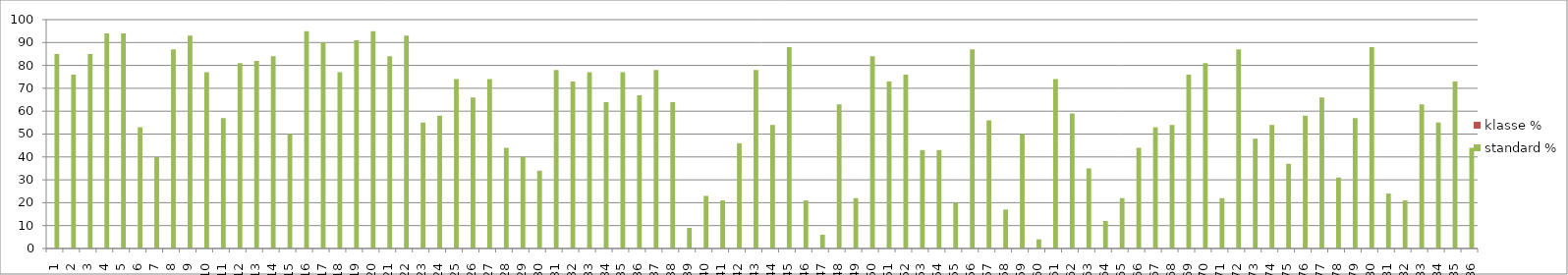
| Category | klasse % | standard % |
|---|---|---|
| 1.0 | 0 | 85 |
| 2.0 | 0 | 76 |
| 3.0 | 0 | 85 |
| 4.0 | 0 | 94 |
| 5.0 | 0 | 94 |
| 6.0 | 0 | 53 |
| 7.0 | 0 | 40 |
| 8.0 | 0 | 87 |
| 9.0 | 0 | 93 |
| 10.0 | 0 | 77 |
| 11.0 | 0 | 57 |
| 12.0 | 0 | 81 |
| 13.0 | 0 | 82 |
| 14.0 | 0 | 84 |
| 15.0 | 0 | 50 |
| 16.0 | 0 | 95 |
| 17.0 | 0 | 90 |
| 18.0 | 0 | 77 |
| 19.0 | 0 | 91 |
| 20.0 | 0 | 95 |
| 21.0 | 0 | 84 |
| 22.0 | 0 | 93 |
| 23.0 | 0 | 55 |
| 24.0 | 0 | 58 |
| 25.0 | 0 | 74 |
| 26.0 | 0 | 66 |
| 27.0 | 0 | 74 |
| 28.0 | 0 | 44 |
| 29.0 | 0 | 40 |
| 30.0 | 0 | 34 |
| 31.0 | 0 | 78 |
| 32.0 | 0 | 73 |
| 33.0 | 0 | 77 |
| 34.0 | 0 | 64 |
| 35.0 | 0 | 77 |
| 36.0 | 0 | 67 |
| 37.0 | 0 | 78 |
| 38.0 | 0 | 64 |
| 39.0 | 0 | 9 |
| 40.0 | 0 | 23 |
| 41.0 | 0 | 21 |
| 42.0 | 0 | 46 |
| 43.0 | 0 | 78 |
| 44.0 | 0 | 54 |
| 45.0 | 0 | 88 |
| 46.0 | 0 | 21 |
| 47.0 | 0 | 6 |
| 48.0 | 0 | 63 |
| 49.0 | 0 | 22 |
| 50.0 | 0 | 84 |
| 51.0 | 0 | 73 |
| 52.0 | 0 | 76 |
| 53.0 | 0 | 43 |
| 54.0 | 0 | 43 |
| 55.0 | 0 | 20 |
| 56.0 | 0 | 87 |
| 57.0 | 0 | 56 |
| 58.0 | 0 | 17 |
| 59.0 | 0 | 50 |
| 60.0 | 0 | 4 |
| 61.0 | 0 | 74 |
| 62.0 | 0 | 59 |
| 63.0 | 0 | 35 |
| 64.0 | 0 | 12 |
| 65.0 | 0 | 22 |
| 66.0 | 0 | 44 |
| 67.0 | 0 | 53 |
| 68.0 | 0 | 54 |
| 69.0 | 0 | 76 |
| 70.0 | 0 | 81 |
| 71.0 | 0 | 22 |
| 72.0 | 0 | 87 |
| 73.0 | 0 | 48 |
| 74.0 | 0 | 54 |
| 75.0 | 0 | 37 |
| 76.0 | 0 | 58 |
| 77.0 | 0 | 66 |
| 78.0 | 0 | 31 |
| 79.0 | 0 | 57 |
| 80.0 | 0 | 88 |
| 81.0 | 0 | 24 |
| 82.0 | 0 | 21 |
| 83.0 | 0 | 63 |
| 84.0 | 0 | 55 |
| 85.0 | 0 | 73 |
| 86.0 | 0 | 44 |